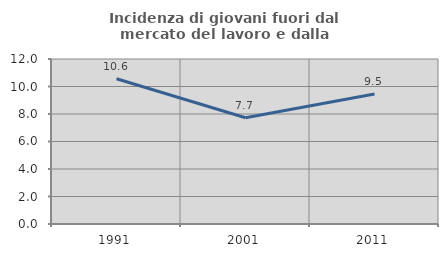
| Category | Incidenza di giovani fuori dal mercato del lavoro e dalla formazione  |
|---|---|
| 1991.0 | 10.568 |
| 2001.0 | 7.727 |
| 2011.0 | 9.459 |